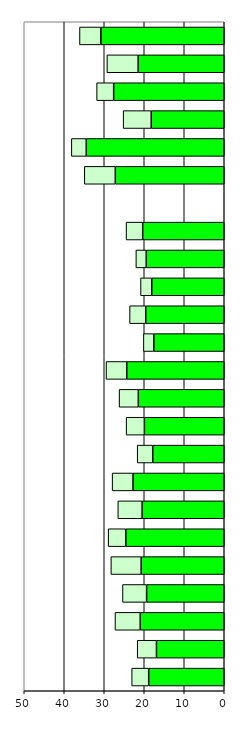
| Category | Series 0 | Series 1 |
|---|---|---|
| 0 | 18.885 | 4.257 |
| 1 | 16.948 | 4.814 |
| 2 | 21.005 | 6.314 |
| 3 | 19.403 | 6.034 |
| 4 | 20.773 | 7.571 |
| 5 | 24.599 | 4.424 |
| 6 | 20.531 | 6.074 |
| 7 | 22.809 | 5.221 |
| 8 | 17.877 | 3.886 |
| 9 | 19.966 | 4.564 |
| 10 | 21.487 | 4.8 |
| 11 | 24.371 | 5.182 |
| 12 | 17.604 | 2.608 |
| 13 | 19.625 | 4.04 |
| 14 | 18.119 | 2.806 |
| 15 | 19.507 | 2.585 |
| 16 | 20.389 | 4.157 |
| 17 | 0 | 0 |
| 18 | 27.238 | 7.749 |
| 19 | 34.496 | 3.729 |
| 20 | 18.254 | 7.021 |
| 21 | 27.647 | 4.26 |
| 22 | 21.53 | 7.81 |
| 23 | 30.837 | 5.353 |